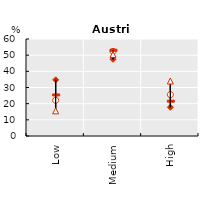
| Category | Series 0 | Series 1 | Series 2 | Series 3 |
|---|---|---|---|---|
| Low | 34.731 | 22.097 | 25.392 | 15.561 |
| Medium | 47.468 | 52.321 | 53.073 | 50.434 |
| High | 17.801 | 25.582 | 21.535 | 34.005 |